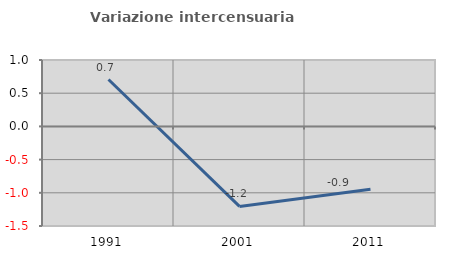
| Category | Variazione intercensuaria annua |
|---|---|
| 1991.0 | 0.706 |
| 2001.0 | -1.205 |
| 2011.0 | -0.945 |